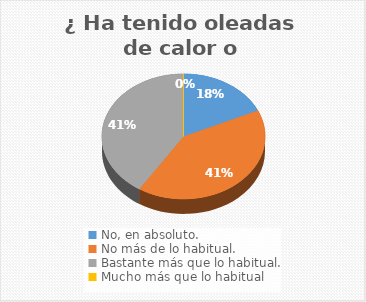
| Category | 7 |
|---|---|
| No, en absoluto. | 20 |
| No más de lo habitual. | 45 |
| Bastante más que lo habitual. | 45 |
| Mucho más que lo habitual | 0 |